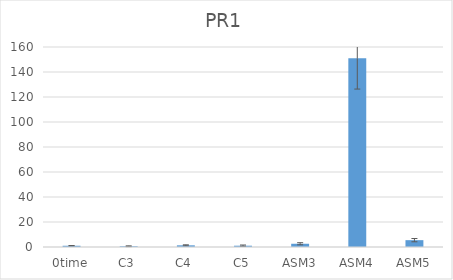
| Category | Series 0 |
|---|---|
| 0time | 1 |
| C3 | 0.597 |
| C4 | 1.345 |
| C5 | 1.038 |
| ASM3 | 2.596 |
| ASM4 | 150.958 |
| ASM5 | 5.477 |